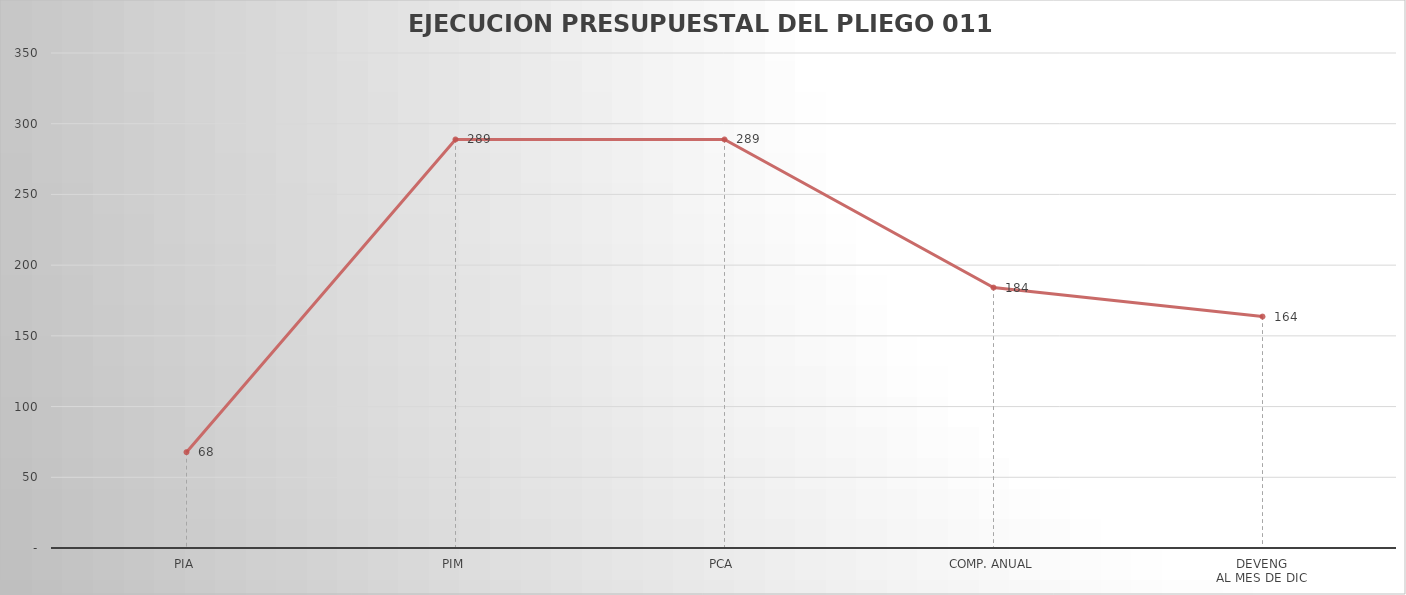
| Category | Series 0 |
|---|---|
| PIA | 67.768 |
| PIM | 288.87 |
| PCA | 288.87 |
| COMP. ANUAL | 184.145 |
| DEVENG
AL MES DE DIC | 163.632 |